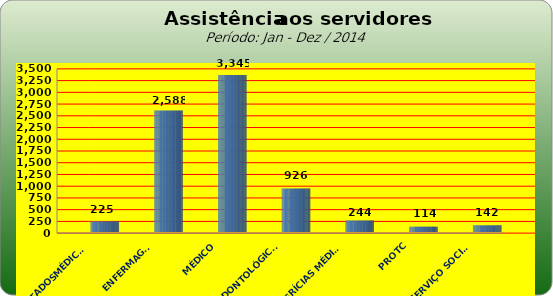
| Category | Series 0 |
|---|---|
| ATESTADOSMÉDICOS | 225 |
| ENFERMAGEM | 2588 |
| MÉDICO | 3345 |
| ODONTOLÓGICOS | 926 |
| PERÍCIAS MÉDICAS | 244 |
| PROTC | 114 |
| SERVIÇO SOCIAL | 142 |